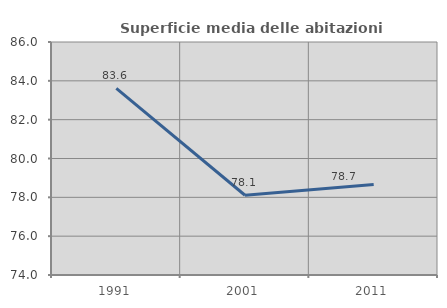
| Category | Superficie media delle abitazioni occupate |
|---|---|
| 1991.0 | 83.609 |
| 2001.0 | 78.107 |
| 2011.0 | 78.665 |